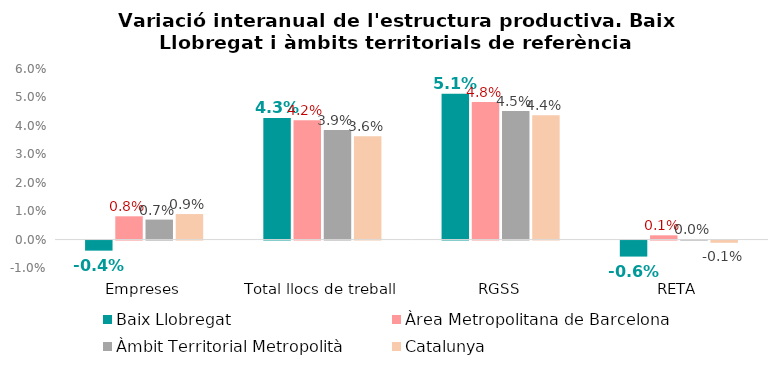
| Category | Baix Llobregat | Àrea Metropolitana de Barcelona | Àmbit Territorial Metropolità | Catalunya |
|---|---|---|---|---|
| Empreses | -0.004 | 0.008 | 0.007 | 0.009 |
| Total llocs de treball | 0.043 | 0.042 | 0.039 | 0.036 |
| RGSS | 0.051 | 0.048 | 0.045 | 0.044 |
| RETA | -0.006 | 0.001 | 0 | -0.001 |